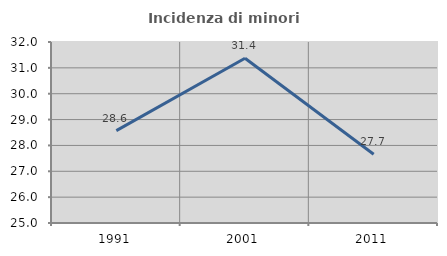
| Category | Incidenza di minori stranieri |
|---|---|
| 1991.0 | 28.571 |
| 2001.0 | 31.373 |
| 2011.0 | 27.66 |